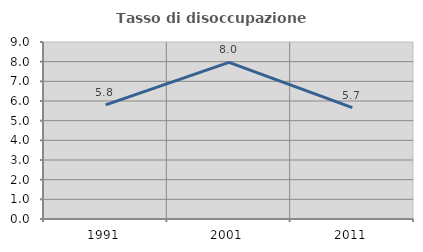
| Category | Tasso di disoccupazione giovanile  |
|---|---|
| 1991.0 | 5.806 |
| 2001.0 | 7.965 |
| 2011.0 | 5.66 |